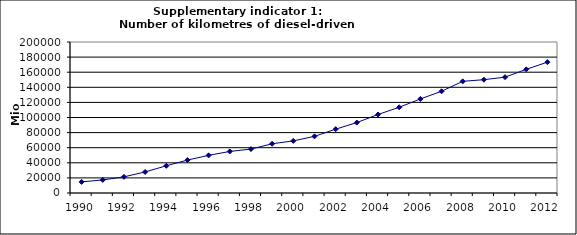
| Category | Number of kilometres of diesel-driven passenger cars, Mio km |
|---|---|
| 1990 | 14720.439 |
| 1991 | 17311.202 |
| 1992 | 21365.834 |
| 1993 | 27875.258 |
| 1994 | 36036.084 |
| 1995 | 43621.394 |
| 1996 | 49883.53 |
| 1997 | 55044.56 |
| 1998 | 58197.523 |
| 1999 | 65220.18 |
| 2000 | 69023.742 |
| 2001 | 75042.05 |
| 2002 | 84555.048 |
| 2003 | 93289.909 |
| 2004 | 103990.421 |
| 2005 | 113535.794 |
| 2006 | 124592.989 |
| 2007 | 134721.355 |
| 2008 | 147870.378 |
| 2009 | 150108.391 |
| 2010 | 153458.566 |
| 2011 | 163824.438 |
| 2012 | 173313.687 |